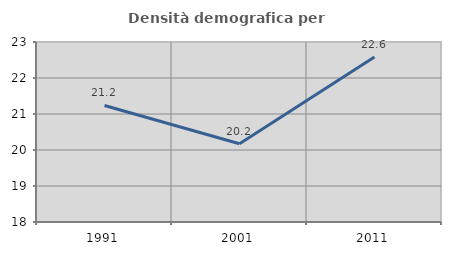
| Category | Densità demografica |
|---|---|
| 1991.0 | 21.237 |
| 2001.0 | 20.175 |
| 2011.0 | 22.582 |